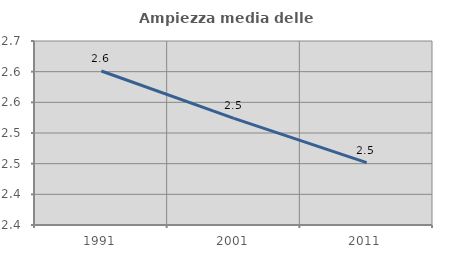
| Category | Ampiezza media delle famiglie |
|---|---|
| 1991.0 | 2.601 |
| 2001.0 | 2.524 |
| 2011.0 | 2.452 |